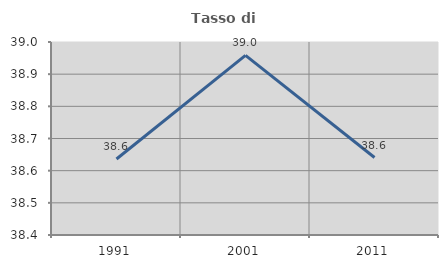
| Category | Tasso di occupazione   |
|---|---|
| 1991.0 | 38.636 |
| 2001.0 | 38.959 |
| 2011.0 | 38.641 |